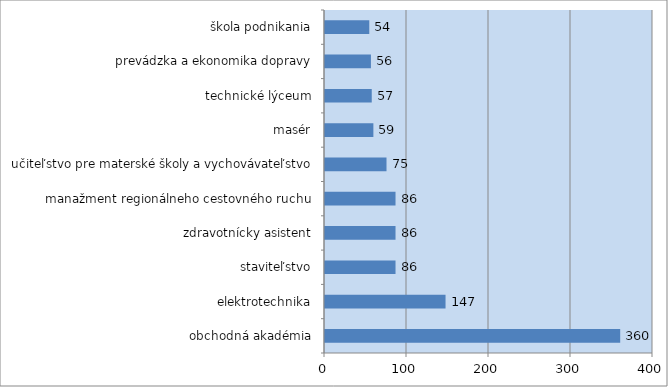
| Category | Series 0 |
|---|---|
| obchodná akadémia | 360 |
| elektrotechnika | 147 |
| staviteľstvo | 86 |
| zdravotnícky asistent | 86 |
| manažment regionálneho cestovného ruchu | 86 |
| učiteľstvo pre materské školy a vychovávateľstvo | 75 |
| masér | 59 |
| technické lýceum | 57 |
| prevádzka a ekonomika dopravy | 56 |
| škola podnikania | 54 |